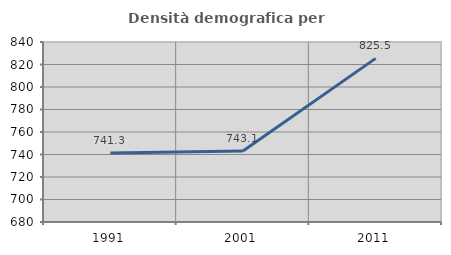
| Category | Densità demografica |
|---|---|
| 1991.0 | 741.274 |
| 2001.0 | 743.089 |
| 2011.0 | 825.453 |